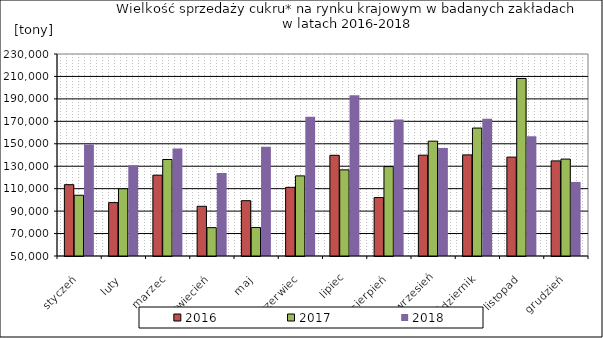
| Category | 2016 | 2017 | 2018 |
|---|---|---|---|
| styczeń | 113573 | 104136.54 | 149394.09 |
| luty | 97585.787 | 109933.585 | 130822.53 |
| marzec | 122028 | 135982.929 | 145863.79 |
| kwiecień | 94282.438 | 75261.914 | 123979.52 |
| maj | 99290 | 75360.525 | 147269.63 |
| czerwiec | 111179 | 121392.865 | 174058.88 |
| lipiec | 139741.157 | 126753.937 | 193169.88 |
| sierpień | 102088.908 | 129695.276 | 171663.7 |
| wrzesień | 139822.201 | 152326.381 | 146323.5 |
| październik | 140110.882 | 164010.68 | 172295.67 |
| listopad | 138105.922 | 208222.94 | 156790.45 |
| grudzień | 134760.348 | 136362.93 | 115997.05 |